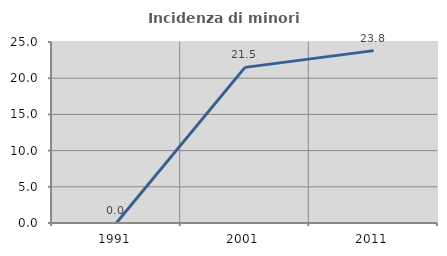
| Category | Incidenza di minori stranieri |
|---|---|
| 1991.0 | 0 |
| 2001.0 | 21.495 |
| 2011.0 | 23.81 |